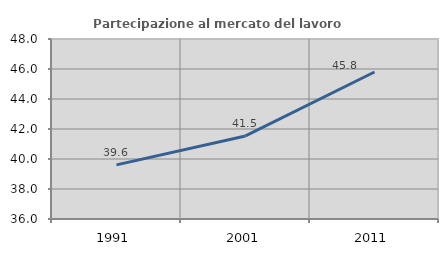
| Category | Partecipazione al mercato del lavoro  femminile |
|---|---|
| 1991.0 | 39.609 |
| 2001.0 | 41.538 |
| 2011.0 | 45.8 |